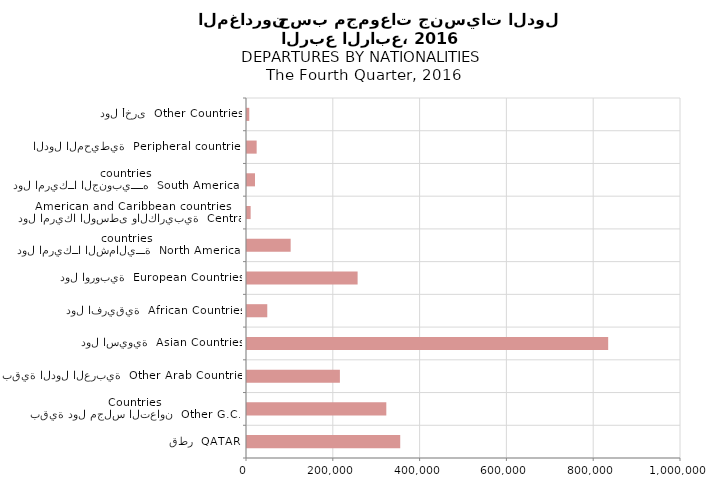
| Category | Series 0 |
|---|---|
| قطر  QATAR | 353053 |
| بقية دول مجلس التعاون  Other G.C.C Countries | 320988 |
| بقية الدول العربية  Other Arab Countries | 214040 |
| دول اسيوية  Asian Countries | 832218 |
| دول افريقية  African Countries | 46709 |
| دول اوروبية  European Countries | 254861 |
| دول امريكــا الشماليـــة  North American countries  | 100592 |
| دول امريكا الوسطى والكاريبية  Central American and Caribbean countries | 8401 |
| دول امريكــا الجنوبيــــه  South American countries | 18419 |
| الدول المحيطية  Peripheral countries | 22244 |
| دول أخرى  Other Countries | 5224 |